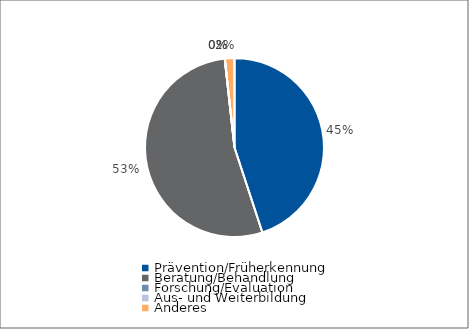
| Category | Series 0 |
|---|---|
| Prävention/Früherkennung | 364508 |
| Beratung/Behandlung | 432200 |
| Forschung/Evaluation | 0 |
| Aus- und Weiterbildung | 0 |
| Anderes | 14123 |